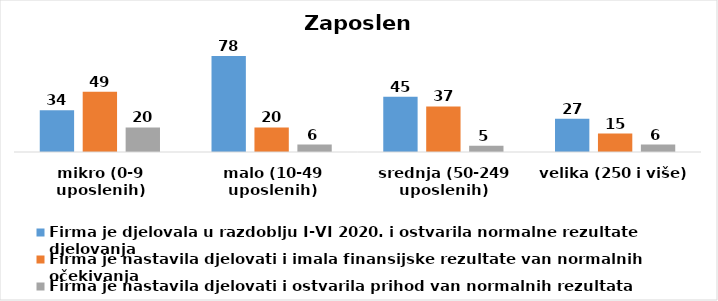
| Category | Firma je djelovala u razdoblju I-VI 2020. i ostvarila normalne rezultate djelovanja | Firma je nastavila djelovati i imala finansijske rezultate van normalnih očekivanja | Firma je nastavila djelovati i ostvarila prihod van normalnih rezultata |
|---|---|---|---|
| mikro (0-9 uposlenih) | 34 | 49 | 20 |
| malo (10-49 uposlenih) | 78 | 20 | 6 |
| srednja (50-249 uposlenih) | 45 | 37 | 5 |
| velika (250 i više) | 27 | 15 | 6 |